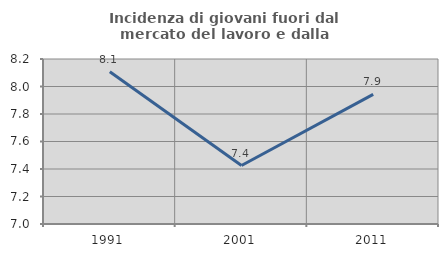
| Category | Incidenza di giovani fuori dal mercato del lavoro e dalla formazione  |
|---|---|
| 1991.0 | 8.107 |
| 2001.0 | 7.425 |
| 2011.0 | 7.943 |